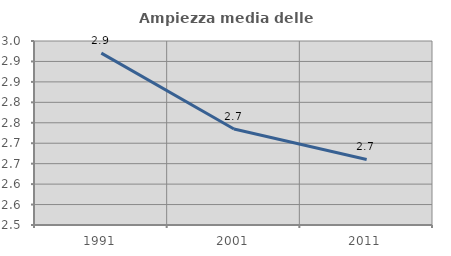
| Category | Ampiezza media delle famiglie |
|---|---|
| 1991.0 | 2.92 |
| 2001.0 | 2.735 |
| 2011.0 | 2.66 |